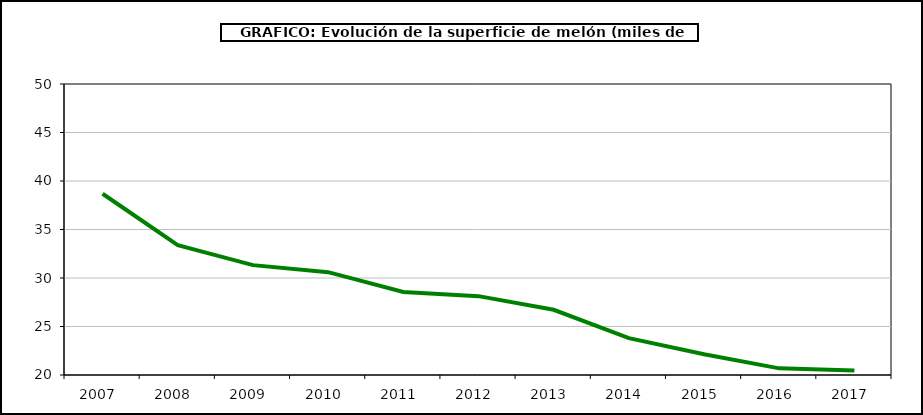
| Category | superficie |
|---|---|
| 2007.0 | 38.688 |
| 2008.0 | 33.388 |
| 2009.0 | 31.327 |
| 2010.0 | 30.601 |
| 2011.0 | 28.561 |
| 2012.0 | 28.13 |
| 2013.0 | 26.723 |
| 2014.0 | 23.8 |
| 2015.0 | 22.144 |
| 2016.0 | 20.686 |
| 2017.0 | 20.473 |